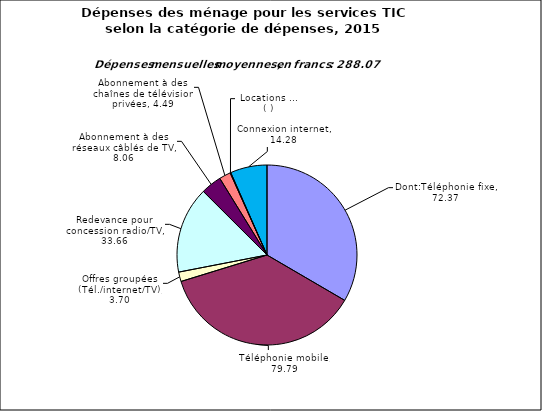
| Category | Dont:Téléphonie fixe |
|---|---|
| Dont:Téléphonie fixe | 72.371 |
| Téléphonie mobile | 79.786 |
| Offres groupées (Tél./internet/TV) | 3.696 |
| Redevance pour concession radio/TV | 33.656 |
| Abonnement à des réseaux câblés de TV | 8.063 |
| Abonnement à des chaînes de télévision privées | 4.49 |
| Location films, appareils | 0.265 |
| Connexion internet | 14.279 |